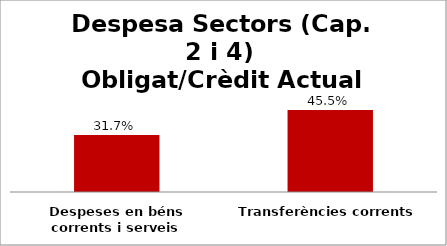
| Category | Series 0 |
|---|---|
| Despeses en béns corrents i serveis | 0.317 |
| Transferències corrents | 0.455 |